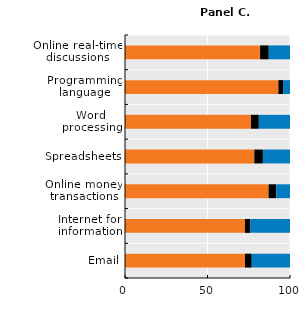
| Category | Never | Less than once a week | At least once a week |
|---|---|---|---|
| Email | 72.741 | 4.063 | 23.196 |
| Internet for information | 72.647 | 3.388 | 23.965 |
| Online money transactions | 87.018 | 4.67 | 8.312 |
| Spreadsheets | 78.373 | 5.201 | 16.426 |
| Word processing | 76.37 | 4.728 | 18.902 |
| Programming language | 92.947 | 3.121 | 3.932 |
| Online real-time discussions | 81.879 | 5.246 | 12.875 |